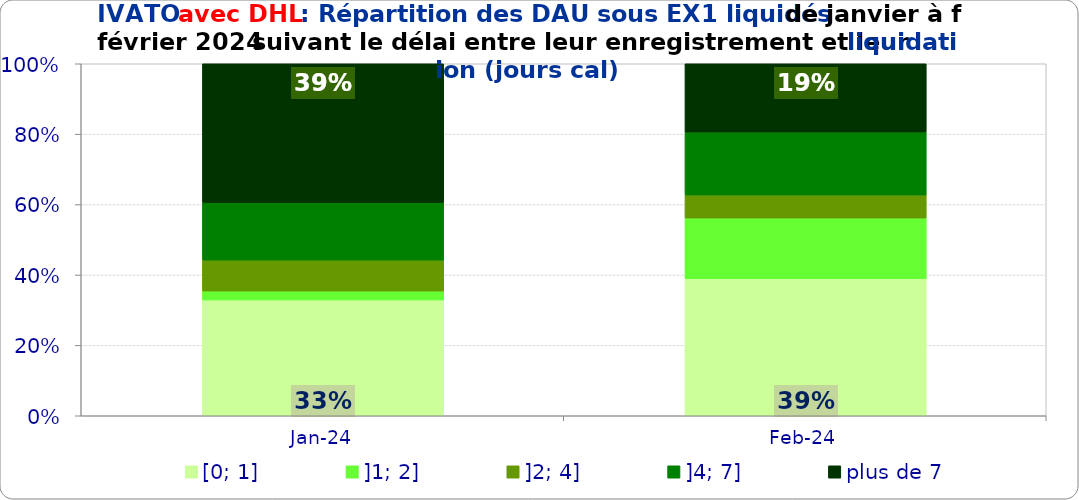
| Category | [0; 1] | ]1; 2] | ]2; 4] | ]4; 7] | plus de 7 |
|---|---|---|---|---|---|
| 2024-01-01 | 0.329 | 0.025 | 0.088 | 0.163 | 0.394 |
| 2024-02-01 | 0.39 | 0.172 | 0.065 | 0.179 | 0.194 |